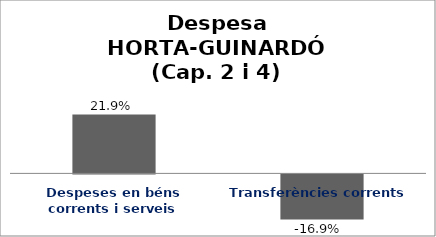
| Category | Series 0 |
|---|---|
| Despeses en béns corrents i serveis | 0.219 |
| Transferències corrents | -0.169 |